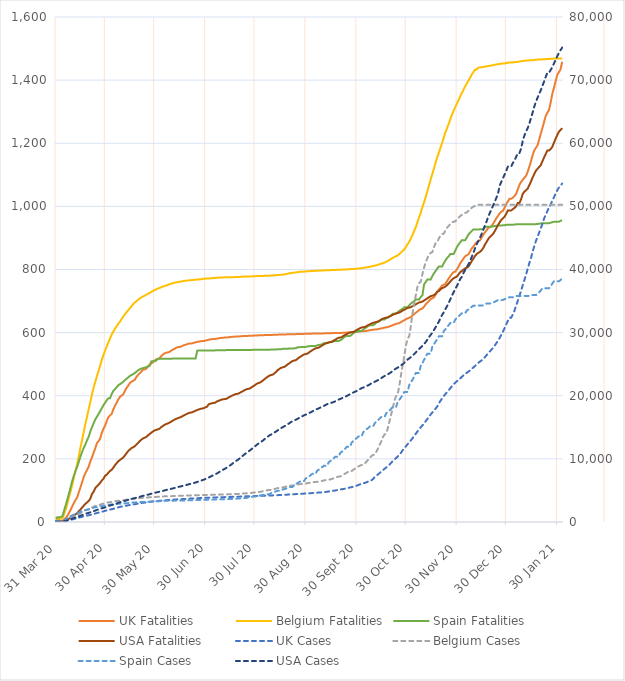
| Category | UK Fatalities | Belgium Fatalities | Spain Fatalities | USA Fatalities |
|---|---|---|---|---|
| 2020-03-31 | 2.192 | 6.673 | 10.998 | 0.641 |
| 2020-04-01 | 2.828 | 9.273 | 15.791 | 0.757 |
| 2020-04-02 | 2.68 | 8.839 | 14.015 | 0.748 |
| 2020-04-03 | 4.265 | 11.093 | 16.454 | 1.249 |
| 2020-04-04 | 4.324 | 12.219 | 17.802 | 1.471 |
| 2020-04-05 | 7.463 | 25.131 | 35.732 | 2.437 |
| 2020-04-06 | 13.002 | 39.864 | 53.106 | 4.446 |
| 2020-04-07 | 18.969 | 57.889 | 71.271 | 7.208 |
| 2020-04-08 | 28.92 | 78.081 | 89.758 | 10.427 |
| 2020-04-09 | 38.649 | 97.059 | 110.085 | 13.207 |
| 2020-04-10 | 49.548 | 117.511 | 130.026 | 16.562 |
| 2020-04-11 | 60.743 | 140.996 | 147.336 | 20.646 |
| 2020-04-12 | 69.613 | 162.401 | 161.757 | 24.129 |
| 2020-04-13 | 78.01 | 184.673 | 175.387 | 28.207 |
| 2020-04-14 | 94.373 | 208.678 | 191.284 | 33.999 |
| 2020-04-15 | 109.625 | 236.582 | 207.481 | 39.84 |
| 2020-04-16 | 126.151 | 260.154 | 222.095 | 45.532 |
| 2020-04-17 | 142.766 | 286.325 | 235.04 | 51.874 |
| 2020-04-18 | 155.249 | 310.937 | 245.952 | 57.439 |
| 2020-04-19 | 164.978 | 333.902 | 259.196 | 61.997 |
| 2020-04-20 | 175.699 | 357.906 | 270.258 | 66.68 |
| 2020-04-21 | 191.633 | 380.525 | 287.097 | 73.998 |
| 2020-04-22 | 204.664 | 404.79 | 300.299 | 88.973 |
| 2020-04-23 | 220.005 | 426.108 | 312.816 | 95.96 |
| 2020-04-24 | 233.525 | 443.873 | 324.905 | 107.416 |
| 2020-04-25 | 249.888 | 461.899 | 333.677 | 113.057 |
| 2020-04-26 | 256.285 | 478.364 | 342.214 | 118.442 |
| 2020-04-27 | 264.726 | 496.216 | 351.415 | 124.085 |
| 2020-04-28 | 282.851 | 513.808 | 360.722 | 131.755 |
| 2020-04-29 | 295.394 | 529.494 | 370.137 | 136.985 |
| 2020-04-30 | 305.493 | 543.013 | 377.989 | 146.646 |
| 2020-05-01 | 320.449 | 556.445 | 386.077 | 149.849 |
| 2020-05-02 | 332.518 | 568.751 | 392.239 | 156.449 |
| 2020-05-03 | 337.908 | 582.096 | 392.239 | 161.576 |
| 2020-05-04 | 342.647 | 593.795 | 405.762 | 165.736 |
| 2020-05-05 | 356.996 | 603.328 | 415.454 | 172.148 |
| 2020-05-06 | 368.383 | 612.601 | 421.189 | 180.083 |
| 2020-05-07 | 377.772 | 620.14 | 427.201 | 186.282 |
| 2020-05-08 | 388.108 | 628.199 | 433.106 | 192.549 |
| 2020-05-09 | 396.756 | 634.699 | 436.615 | 196.551 |
| 2020-05-10 | 400.502 | 642.845 | 440.124 | 200.492 |
| 2020-05-11 | 404.53 | 651.078 | 444.083 | 204.297 |
| 2020-05-12 | 415.281 | 658.097 | 449.304 | 210.813 |
| 2020-05-13 | 424.862 | 664.683 | 453.861 | 217.963 |
| 2020-05-14 | 431.644 | 670.836 | 457.734 | 224.767 |
| 2020-05-15 | 440.218 | 677.249 | 462.591 | 229.356 |
| 2020-05-16 | 444.29 | 683.402 | 465.65 | 234.261 |
| 2020-05-17 | 447.504 | 689.642 | 468.282 | 236.491 |
| 2020-05-18 | 450.273 | 695.274 | 472.048 | 240.004 |
| 2020-05-19 | 459.365 | 699.174 | 475.985 | 245.18 |
| 2020-05-20 | 465.984 | 704.027 | 480.628 | 250.486 |
| 2020-05-21 | 471.197 | 707.754 | 483.581 | 255.874 |
| 2020-05-22 | 476.38 | 711.653 | 485.806 | 260.924 |
| 2020-05-23 | 482.466 | 714.253 | 487.667 | 264.528 |
| 2020-05-24 | 483.458 | 716.939 | 488.93 | 266.984 |
| 2020-05-25 | 485.62 | 720.146 | 490.406 | 269.388 |
| 2020-05-26 | 493.024 | 723.006 | 492.76 | 274.153 |
| 2020-05-27 | 497.881 | 725.606 | 493.872 | 278.766 |
| 2020-05-28 | 501.924 | 728.552 | 508.593 | 282.604 |
| 2020-05-29 | 506.233 | 732.105 | 509.663 | 286.57 |
| 2020-05-30 | 509.491 | 734.272 | 511.246 | 289.852 |
| 2020-05-31 | 515.103 | 737.131 | 511.246 | 291.775 |
| 2020-06-01 | 516.643 | 739.384 | 517.301 | 293.295 |
| 2020-06-02 | 518.583 | 741.464 | 517.323 | 295.41 |
| 2020-06-03 | 524.832 | 743.544 | 517.344 | 300.047 |
| 2020-06-04 | 529.911 | 745.797 | 517.387 | 303.618 |
| 2020-06-05 | 533.969 | 747.184 | 517.473 | 307.322 |
| 2020-06-06 | 536.249 | 749.177 | 517.515 | 310.194 |
| 2020-06-07 | 537.138 | 751.084 | 517.515 | 312.024 |
| 2020-06-08 | 538.411 | 752.903 | 517.515 | 314.345 |
| 2020-06-09 | 542.098 | 754.897 | 517.537 | 317.488 |
| 2020-06-10 | 545.86 | 756.63 | 517.644 | 320.508 |
| 2020-06-11 | 547.785 | 757.843 | 517.665 | 323.657 |
| 2020-06-12 | 551.605 | 758.883 | 517.687 | 326.489 |
| 2020-06-13 | 553.723 | 759.836 | 517.708 | 328.491 |
| 2020-06-14 | 554.523 | 760.876 | 517.708 | 330.655 |
| 2020-06-15 | 555.218 | 761.656 | 517.708 | 332.153 |
| 2020-06-16 | 558.106 | 762.696 | 517.708 | 335.189 |
| 2020-06-17 | 560.535 | 763.736 | 517.708 | 337.979 |
| 2020-06-18 | 561.66 | 764.343 | 517.708 | 340.702 |
| 2020-06-19 | 563.6 | 765.209 | 517.708 | 343.282 |
| 2020-06-20 | 565.184 | 765.643 | 517.708 | 345.613 |
| 2020-06-21 | 565.584 | 765.902 | 517.708 | 346.512 |
| 2020-06-22 | 566.014 | 766.596 | 517.708 | 347.713 |
| 2020-06-23 | 567.791 | 767.202 | 517.708 | 350.253 |
| 2020-06-24 | 569.42 | 767.809 | 517.708 | 352.544 |
| 2020-06-25 | 570.412 | 768.242 | 542.934 | 354.723 |
| 2020-06-26 | 571.656 | 768.589 | 543.084 | 356.784 |
| 2020-06-27 | 572.707 | 768.849 | 543.105 | 358.628 |
| 2020-06-28 | 573.166 | 769.629 | 543.127 | 359.406 |
| 2020-06-29 | 573.373 | 770.669 | 543.148 | 360.704 |
| 2020-06-30 | 574.765 | 771.015 | 543.191 | 363.214 |
| 2020-07-01 | 576.054 | 771.275 | 543.255 | 365.496 |
| 2020-07-02 | 577.52 | 771.709 | 543.426 | 372.902 |
| 2020-07-03 | 578.66 | 771.882 | 543.491 | 374.795 |
| 2020-07-04 | 579.252 | 772.575 | 543.533 | 376.315 |
| 2020-07-05 | 579.711 | 773.009 | 543.598 | 377.12 |
| 2020-07-06 | 580.022 | 773.269 | 543.79 | 378.141 |
| 2020-07-07 | 580.807 | 773.962 | 543.961 | 382.001 |
| 2020-07-08 | 582.243 | 774.135 | 544.068 | 383.982 |
| 2020-07-09 | 582.851 | 774.569 | 544.432 | 386.042 |
| 2020-07-10 | 583.576 | 774.742 | 544.432 | 388.151 |
| 2020-07-11 | 584.05 | 775.002 | 544.432 | 388.887 |
| 2020-07-12 | 584.331 | 775.175 | 544.496 | 389.71 |
| 2020-07-13 | 584.494 | 775.262 | 544.582 | 390.801 |
| 2020-07-14 | 585.294 | 775.522 | 544.667 | 394.369 |
| 2020-07-15 | 586.138 | 775.608 | 544.774 | 396.888 |
| 2020-07-16 | 586.597 | 775.782 | 544.817 | 399.872 |
| 2020-07-17 | 587.101 | 775.782 | 544.817 | 402.322 |
| 2020-07-18 | 587.352 | 775.955 | 544.817 | 404.501 |
| 2020-07-19 | 587.486 | 776.302 | 544.881 | 405.689 |
| 2020-07-20 | 587.634 | 776.302 | 544.946 | 406.905 |
| 2020-07-21 | 588.285 | 776.562 | 545.031 | 409.521 |
| 2020-07-22 | 588.67 | 776.995 | 545.095 | 412.417 |
| 2020-07-23 | 589.026 | 777.428 | 545.181 | 415.271 |
| 2020-07-24 | 589.411 | 777.602 | 545.181 | 418.03 |
| 2020-07-25 | 589.544 | 777.862 | 545.181 | 420.622 |
| 2020-07-26 | 589.707 | 777.948 | 545.224 | 421.883 |
| 2020-07-27 | 589.855 | 778.122 | 545.267 | 423.014 |
| 2020-07-28 | 590.225 | 778.208 | 545.309 | 426.539 |
| 2020-07-29 | 590.477 | 778.382 | 545.374 | 429.955 |
| 2020-07-30 | 590.61 | 778.555 | 545.438 | 433.152 |
| 2020-07-31 | 591.084 | 778.988 | 545.438 | 437.114 |
| 2020-08-01 | 591.306 | 779.075 | 545.438 | 439.892 |
| 2020-08-02 | 591.425 | 779.248 | 545.481 | 441.335 |
| 2020-08-03 | 591.469 | 779.595 | 545.523 | 444.605 |
| 2020-08-04 | 591.78 | 779.681 | 545.63 | 448.389 |
| 2020-08-05 | 592.283 | 779.941 | 545.673 | 452.816 |
| 2020-08-06 | 592.283 | 780.115 | 545.716 | 456.94 |
| 2020-08-07 | 592.58 | 780.375 | 545.716 | 460.721 |
| 2020-08-08 | 592.772 | 780.548 | 545.716 | 464.164 |
| 2020-08-09 | 592.846 | 780.981 | 546.294 | 465.419 |
| 2020-08-10 | 592.861 | 781.241 | 546.85 | 467.069 |
| 2020-08-11 | 593.127 | 781.675 | 546.871 | 471.333 |
| 2020-08-12 | 593.335 | 782.108 | 546.893 | 475.739 |
| 2020-08-13 | 593.601 | 782.455 | 546.957 | 481.355 |
| 2020-08-14 | 593.779 | 782.975 | 546.957 | 485.16 |
| 2020-08-15 | 593.823 | 783.148 | 546.957 | 488.408 |
| 2020-08-16 | 593.897 | 783.581 | 548.519 | 489.967 |
| 2020-08-17 | 594.164 | 784.534 | 548.626 | 491.557 |
| 2020-08-18 | 594.357 | 785.661 | 548.626 | 494.826 |
| 2020-08-19 | 594.653 | 786.614 | 549.182 | 499.354 |
| 2020-08-20 | 594.919 | 787.654 | 549.439 | 502.646 |
| 2020-08-21 | 595.082 | 788.694 | 549.439 | 506.705 |
| 2020-08-22 | 595.127 | 789.474 | 549.439 | 509.851 |
| 2020-08-23 | 595.201 | 790.081 | 550.059 | 511.586 |
| 2020-08-24 | 595.245 | 790.687 | 550.573 | 512.938 |
| 2020-08-25 | 595.423 | 791.641 | 553.29 | 516.962 |
| 2020-08-26 | 595.66 | 792.42 | 553.633 | 521.083 |
| 2020-08-27 | 595.749 | 792.767 | 554.167 | 524.359 |
| 2020-08-28 | 595.778 | 793.027 | 554.167 | 527.856 |
| 2020-08-29 | 596.045 | 793.46 | 554.167 | 530.762 |
| 2020-08-30 | 596.134 | 793.72 | 554.895 | 532.111 |
| 2020-08-31 | 596.193 | 794.154 | 556.008 | 533.548 |
| 2020-09-01 | 596.43 | 794.587 | 557.013 | 537.216 |
| 2020-09-02 | 596.667 | 794.934 | 557.548 | 540.948 |
| 2020-09-03 | 596.844 | 795.194 | 557.869 | 544.321 |
| 2020-09-04 | 596.978 | 795.54 | 557.869 | 547.205 |
| 2020-09-05 | 597.155 | 796.06 | 557.869 | 550.262 |
| 2020-09-06 | 597.17 | 796.147 | 559.645 | 551.144 |
| 2020-09-07 | 597.2 | 796.407 | 560.886 | 552.751 |
| 2020-09-08 | 597.244 | 796.667 | 561.785 | 556.067 |
| 2020-09-09 | 597.392 | 796.84 | 562.64 | 559.273 |
| 2020-09-10 | 597.585 | 797.187 | 566.577 | 562.473 |
| 2020-09-11 | 597.733 | 797.36 | 566.577 | 565.414 |
| 2020-09-12 | 597.911 | 797.447 | 566.577 | 567.763 |
| 2020-09-13 | 597.94 | 797.62 | 568.674 | 568.988 |
| 2020-09-14 | 597.985 | 797.967 | 570.343 | 569.799 |
| 2020-09-15 | 598.458 | 798.227 | 571.071 | 571.231 |
| 2020-09-16 | 598.577 | 798.4 | 572.59 | 574.683 |
| 2020-09-17 | 598.784 | 798.66 | 573.617 | 577.643 |
| 2020-09-18 | 598.873 | 799.093 | 573.617 | 581.372 |
| 2020-09-19 | 599.006 | 799.18 | 573.617 | 583.453 |
| 2020-09-20 | 599.08 | 799.267 | 575.778 | 584.602 |
| 2020-09-21 | 599.214 | 799.613 | 579.116 | 585.973 |
| 2020-09-22 | 599.613 | 799.873 | 584.229 | 590.248 |
| 2020-09-23 | 599.91 | 800.047 | 587.696 | 592.877 |
| 2020-09-24 | 600.221 | 800.133 | 589.621 | 595.402 |
| 2020-09-25 | 600.62 | 800.653 | 589.621 | 598.307 |
| 2020-09-26 | 601.02 | 801.346 | 589.621 | 600.341 |
| 2020-09-27 | 601.287 | 801.606 | 593.216 | 601.103 |
| 2020-09-28 | 601.45 | 801.866 | 598.372 | 602.234 |
| 2020-09-29 | 601.998 | 801.953 | 601.154 | 605.048 |
| 2020-09-30 | 602.545 | 802.646 | 602.951 | 608.397 |
| 2020-10-01 | 603.138 | 802.993 | 605.39 | 611.135 |
| 2020-10-02 | 603.641 | 803.426 | 605.39 | 614.064 |
| 2020-10-03 | 604.16 | 803.946 | 605.39 | 616.261 |
| 2020-10-04 | 604.411 | 804.986 | 609.22 | 617.048 |
| 2020-10-05 | 604.604 | 806.113 | 613.564 | 618.003 |
| 2020-10-06 | 605.655 | 806.979 | 617.351 | 620.823 |
| 2020-10-07 | 606.707 | 807.499 | 621.245 | 623.649 |
| 2020-10-08 | 607.58 | 808.799 | 623.663 | 626.323 |
| 2020-10-09 | 608.558 | 809.753 | 623.663 | 629.083 |
| 2020-10-10 | 609.283 | 811.052 | 623.663 | 631.143 |
| 2020-10-11 | 609.772 | 812.266 | 626.637 | 632.359 |
| 2020-10-12 | 610.053 | 813.479 | 632.222 | 633.568 |
| 2020-10-13 | 611.179 | 815.039 | 633.848 | 635.747 |
| 2020-10-14 | 612.215 | 816.772 | 636.544 | 638.458 |
| 2020-10-15 | 613.355 | 818.505 | 641.7 | 641.411 |
| 2020-10-16 | 614.644 | 820.152 | 641.7 | 644.493 |
| 2020-10-17 | 615.843 | 822.058 | 641.7 | 646.286 |
| 2020-10-18 | 616.806 | 824.311 | 645.873 | 647.483 |
| 2020-10-19 | 617.546 | 827.431 | 647.584 | 648.437 |
| 2020-10-20 | 619.664 | 830.378 | 652.056 | 650.92 |
| 2020-10-21 | 621.692 | 833.931 | 655.052 | 653.868 |
| 2020-10-22 | 623.736 | 836.964 | 659.802 | 656.384 |
| 2020-10-23 | 625.75 | 840.084 | 659.802 | 659.116 |
| 2020-10-24 | 627.971 | 842.077 | 659.802 | 661.213 |
| 2020-10-25 | 628.963 | 844.763 | 664.445 | 662.383 |
| 2020-10-26 | 630.148 | 849.27 | 669.109 | 663.778 |
| 2020-10-27 | 633.717 | 853.776 | 672.447 | 666.613 |
| 2020-10-28 | 636.545 | 859.149 | 675.763 | 670.062 |
| 2020-10-29 | 639.344 | 863.915 | 680.706 | 672.618 |
| 2020-10-30 | 642.661 | 872.061 | 680.706 | 675.514 |
| 2020-10-31 | 645.238 | 880.121 | 680.706 | 678.261 |
| 2020-11-01 | 647.474 | 888.267 | 686.676 | 679.267 |
| 2020-11-02 | 648.984 | 898.753 | 692.388 | 680.802 |
| 2020-11-03 | 654.419 | 910.192 | 695.983 | 683.804 |
| 2020-11-04 | 659.009 | 922.497 | 699.685 | 686.773 |
| 2020-11-05 | 663.155 | 934.543 | 704.798 | 689.715 |
| 2020-11-06 | 667.213 | 950.575 | 704.798 | 692.875 |
| 2020-11-07 | 672.04 | 965.914 | 704.798 | 695.452 |
| 2020-11-08 | 674.439 | 980.126 | 712.908 | 696.79 |
| 2020-11-09 | 676.453 | 998.152 | 718 | 698.476 |
| 2020-11-10 | 682.332 | 1013.057 | 752.726 | 701.746 |
| 2020-11-11 | 689.618 | 1030.216 | 760.6 | 705.095 |
| 2020-11-12 | 695.215 | 1048.068 | 768.025 | 708.766 |
| 2020-11-13 | 700.472 | 1066.613 | 768.025 | 712.297 |
| 2020-11-14 | 706.588 | 1084.639 | 768.025 | 715.379 |
| 2020-11-15 | 708.898 | 1102.837 | 778.98 | 716.773 |
| 2020-11-16 | 711.771 | 1119.649 | 787.774 | 718.837 |
| 2020-11-17 | 719.649 | 1138.541 | 795.241 | 723.189 |
| 2020-11-18 | 728.46 | 1155.527 | 802.858 | 729.622 |
| 2020-11-19 | 736.797 | 1170.519 | 809.448 | 731.537 |
| 2020-11-20 | 742.364 | 1186.378 | 809.448 | 737.356 |
| 2020-11-21 | 749.206 | 1201.543 | 809.448 | 741.17 |
| 2020-11-22 | 751.694 | 1218.182 | 819.804 | 743.036 |
| 2020-11-23 | 754.848 | 1235.081 | 829.112 | 746.093 |
| 2020-11-24 | 763.703 | 1248.34 | 836.622 | 750.551 |
| 2020-11-25 | 771.537 | 1262.032 | 842.014 | 756.173 |
| 2020-11-26 | 778.956 | 1276.937 | 849.032 | 762.306 |
| 2020-11-27 | 786.523 | 1291.236 | 849.032 | 767.952 |
| 2020-11-28 | 791.557 | 1303.022 | 849.032 | 772.468 |
| 2020-11-29 | 793.408 | 1314.721 | 859.987 | 775.151 |
| 2020-11-30 | 800.501 | 1326.767 | 871.476 | 777.944 |
| 2020-12-01 | 809.505 | 1337.08 | 879.372 | 784.702 |
| 2020-12-02 | 819.797 | 1348.952 | 886.582 | 791.816 |
| 2020-12-03 | 827.171 | 1359.178 | 892.873 | 795.43 |
| 2020-12-04 | 834.871 | 1369.924 | 892.873 | 799.696 |
| 2020-12-05 | 841.964 | 1379.803 | 892.873 | 803.355 |
| 2020-12-06 | 845.148 | 1389.942 | 901.453 | 805.817 |
| 2020-12-07 | 848.154 | 1398.262 | 910.91 | 809.378 |
| 2020-12-08 | 857.084 | 1407.534 | 916.751 | 817.279 |
| 2020-12-09 | 866.679 | 1417.76 | 922.186 | 826.974 |
| 2020-12-10 | 872.81 | 1425.56 | 926.765 | 834.513 |
| 2020-12-11 | 880.273 | 1433.012 | 926.765 | 842.657 |
| 2020-12-12 | 886.152 | 1433.706 | 926.765 | 849.352 |
| 2020-12-13 | 889.573 | 1439.425 | 926.765 | 852.728 |
| 2020-12-14 | 892.371 | 1440.119 | 927.407 | 856.092 |
| 2020-12-15 | 901.242 | 1440.985 | 927.407 | 860.739 |
| 2020-12-16 | 910.112 | 1441.852 | 927.407 | 868.494 |
| 2020-12-17 | 917.753 | 1442.372 | 934.361 | 878.796 |
| 2020-12-18 | 924.031 | 1443.758 | 935.43 | 887.15 |
| 2020-12-19 | 931.732 | 1444.798 | 935.43 | 896.255 |
| 2020-12-20 | 933.864 | 1445.318 | 935.43 | 903.174 |
| 2020-12-21 | 937.3 | 1446.618 | 935.944 | 907.532 |
| 2020-12-22 | 944.792 | 1447.311 | 936.864 | 912.862 |
| 2020-12-23 | 953.855 | 1448.525 | 937.677 | 921.803 |
| 2020-12-24 | 962.918 | 1449.738 | 938.49 | 930.743 |
| 2020-12-25 | 970.159 | 1450.518 | 939.303 | 941.206 |
| 2020-12-26 | 978.067 | 1451.384 | 939.303 | 949.554 |
| 2020-12-27 | 982.894 | 1452.251 | 939.303 | 957.449 |
| 2020-12-28 | 986.078 | 1452.858 | 939.966 | 962.22 |
| 2020-12-29 | 996.31 | 1452.858 | 940.48 | 967.429 |
| 2020-12-30 | 1007.328 | 1453.984 | 941.464 | 976.996 |
| 2020-12-31 | 1015.827 | 1455.197 | 942.02 | 987.167 |
| 2021-01-01 | 1024.268 | 1455.717 | 942.02 | 987.167 |
| 2021-01-02 | 1024.268 | 1455.717 | 942.02 | 987.167 |
| 2021-01-03 | 1027.378 | 1456.151 | 942.02 | 991.105 |
| 2021-01-04 | 1032.664 | 1456.844 | 942.448 | 995.159 |
| 2021-01-05 | 1039.446 | 1457.797 | 943.219 | 1000.565 |
| 2021-01-06 | 1053.973 | 1457.797 | 943.219 | 1010.794 |
| 2021-01-07 | 1068.248 | 1459.27 | 943.219 | 1010.794 |
| 2021-01-08 | 1077.326 | 1459.964 | 943.219 | 1022.224 |
| 2021-01-09 | 1083.915 | 1460.57 | 943.219 | 1039.555 |
| 2021-01-10 | 1090.638 | 1461.264 | 943.219 | 1046.55 |
| 2021-01-11 | 1096.665 | 1461.957 | 943.219 | 1050.826 |
| 2021-01-12 | 1109.608 | 1461.957 | 943.219 | 1056.269 |
| 2021-01-13 | 1125.023 | 1462.564 | 943.219 | 1067.005 |
| 2021-01-14 | 1142.23 | 1463.257 | 943.732 | 1078.629 |
| 2021-01-15 | 1161.851 | 1463.257 | 943.732 | 1091.32 |
| 2021-01-16 | 1177.178 | 1463.777 | 943.732 | 1102.257 |
| 2021-01-17 | 1185.515 | 1464.557 | 943.732 | 1112.644 |
| 2021-01-18 | 1193.348 | 1465.163 | 944.182 | 1118.937 |
| 2021-01-19 | 1211.755 | 1465.163 | 945.102 | 1124.875 |
| 2021-01-20 | 1230.161 | 1465.163 | 946.022 | 1130.813 |
| 2021-01-21 | 1248.642 | 1465.77 | 946.749 | 1143.2 |
| 2021-01-22 | 1267.596 | 1466.463 | 946.749 | 1155.024 |
| 2021-01-23 | 1286.773 | 1466.463 | 946.749 | 1166.18 |
| 2021-01-24 | 1296.709 | 1466.81 | 946.749 | 1176.99 |
| 2021-01-25 | 1305.579 | 1466.81 | 946.749 | 1176.99 |
| 2021-01-26 | 1329.421 | 1468.023 | 948.204 | 1181.752 |
| 2021-01-27 | 1356.371 | 1468.023 | 949.916 | 1188.68 |
| 2021-01-28 | 1375.474 | 1468.37 | 951.627 | 1201.954 |
| 2021-01-29 | 1396.22 | 1468.37 | 951.627 | 1214.046 |
| 2021-01-30 | 1416.182 | 1468.37 | 951.627 | 1225.852 |
| 2021-01-31 | 1425.215 | 1468.37 | 951.627 | 1236.233 |
| 2021-02-01 | 1433.981 | 1468.37 | 954.174 | 1242.071 |
| 2021-02-02 | 1458.133 | 1468.37 | 955.864 | 1247.799 |